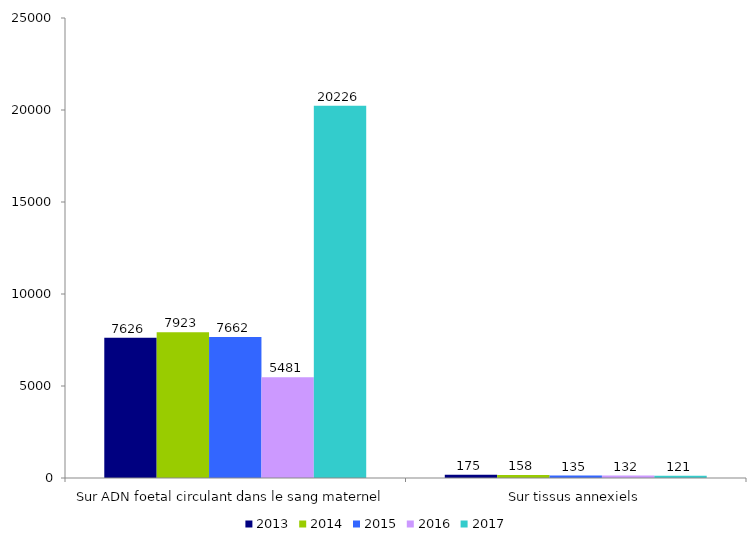
| Category | 2013 | 2014 | 2015 | 2016 | 2017 |
|---|---|---|---|---|---|
| Sur ADN foetal circulant dans le sang maternel | 7626 | 7923 | 7662 | 5481 | 20226 |
| Sur tissus annexiels | 175 | 158 | 135 | 132 | 121 |